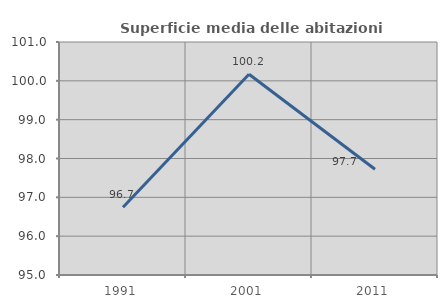
| Category | Superficie media delle abitazioni occupate |
|---|---|
| 1991.0 | 96.746 |
| 2001.0 | 100.169 |
| 2011.0 | 97.723 |